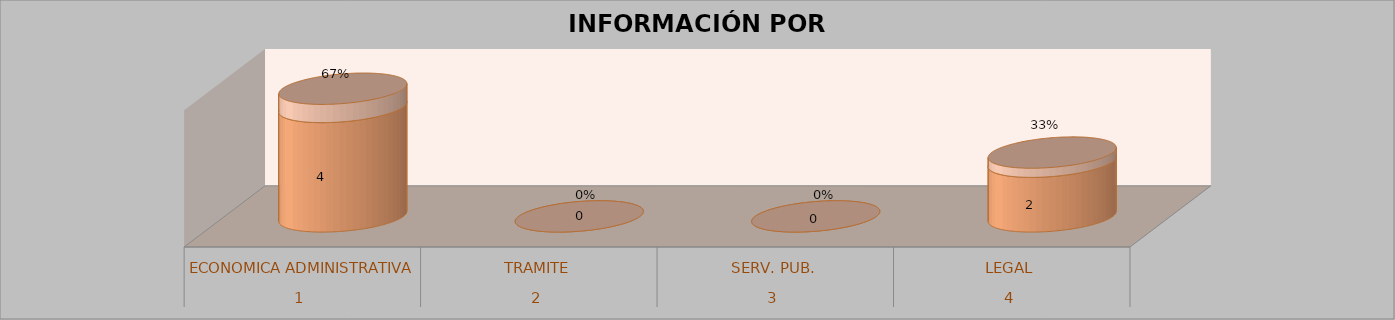
| Category | Series 0 | Series 1 | Series 2 | Series 3 |
|---|---|---|---|---|
| 0 |  |  | 4 | 0.667 |
| 1 |  |  | 0 | 0 |
| 2 |  |  | 0 | 0 |
| 3 |  |  | 2 | 0.333 |